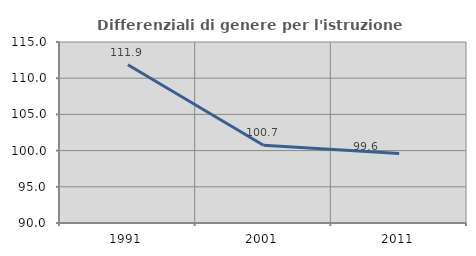
| Category | Differenziali di genere per l'istruzione superiore |
|---|---|
| 1991.0 | 111.854 |
| 2001.0 | 100.741 |
| 2011.0 | 99.589 |